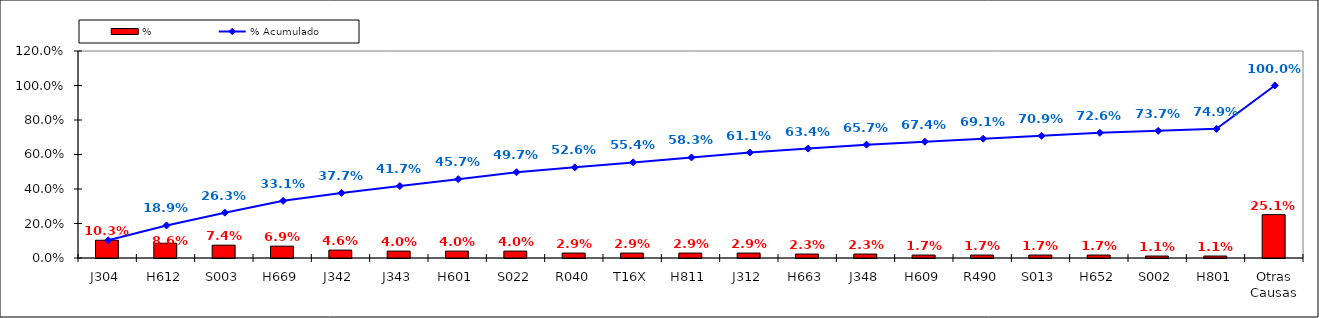
| Category | % |
|---|---|
| J304 | 0.103 |
| H612 | 0.086 |
| S003 | 0.074 |
| H669 | 0.069 |
| J342 | 0.046 |
| J343 | 0.04 |
| H601 | 0.04 |
| S022 | 0.04 |
| R040 | 0.029 |
| T16X | 0.029 |
| H811 | 0.029 |
| J312 | 0.029 |
| H663 | 0.023 |
| J348 | 0.023 |
| H609 | 0.017 |
| R490 | 0.017 |
| S013 | 0.017 |
| H652 | 0.017 |
| S002 | 0.011 |
| H801 | 0.011 |
| Otras Causas | 0.251 |